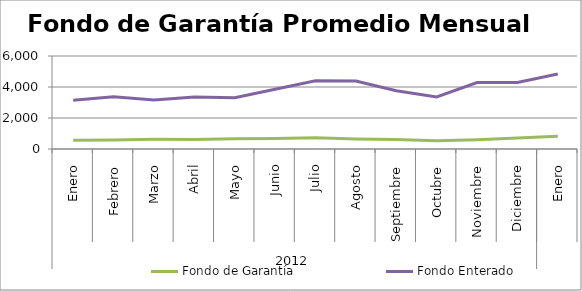
| Category | Fondo de Garantía | Fondo Enterado |
|---|---|---|
| 0 | 560.173 | 3141.641 |
| 1 | 575.916 | 3362.648 |
| 2 | 622.075 | 3154.118 |
| 3 | 612.299 | 3348.058 |
| 4 | 654.277 | 3308.859 |
| 5 | 675.965 | 3850.375 |
| 6 | 729.97 | 4400.539 |
| 7 | 649.095 | 4383.327 |
| 8 | 606.03 | 3757.632 |
| 9 | 525.314 | 3362.932 |
| 10 | 591.646 | 4285.609 |
| 11 | 703.403 | 4296.87 |
| 12 | 823.344 | 4842.786 |